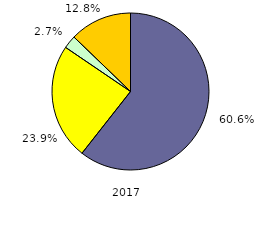
| Category | 2017 |
|---|---|
| 0 | 60.6 |
| 1 | 23.9 |
| 2 | 2.7 |
| 3 | 12.8 |